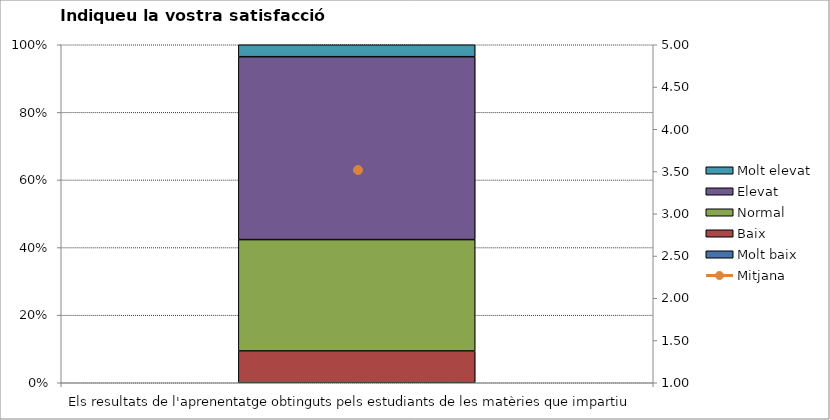
| Category | Molt baix | Baix | Normal  | Elevat | Molt elevat |
|---|---|---|---|---|---|
| Els resultats de l'aprenentatge obtinguts pels estudiants de les matèries que impartiu | 0 | 8 | 28 | 46 | 3 |